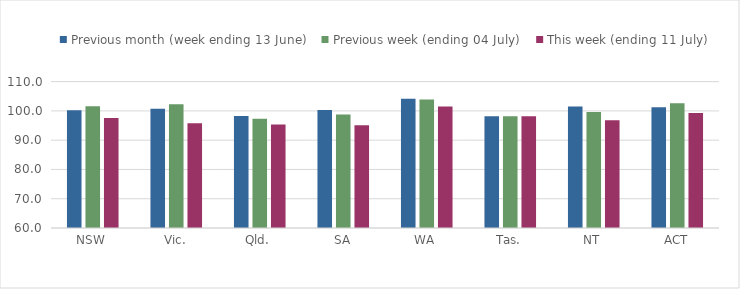
| Category | Previous month (week ending 13 June) | Previous week (ending 04 July) | This week (ending 11 July) |
|---|---|---|---|
| NSW | 100.265 | 101.579 | 97.549 |
| Vic. | 100.778 | 102.244 | 95.759 |
| Qld. | 98.281 | 97.3 | 95.363 |
| SA | 100.272 | 98.738 | 95.116 |
| WA | 104.152 | 103.907 | 101.479 |
| Tas. | 98.17 | 98.17 | 98.17 |
| NT | 101.508 | 99.611 | 96.819 |
| ACT | 101.219 | 102.601 | 99.304 |